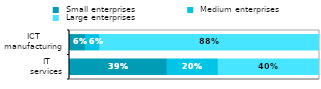
| Category |  Small enterprises |  Medium enterprises |  Large enterprises |
|---|---|---|---|
|  IT 
services | 0.392 | 0.204 | 0.404 |
|  ICT 
manufacturing | 0.064 | 0.059 | 0.877 |